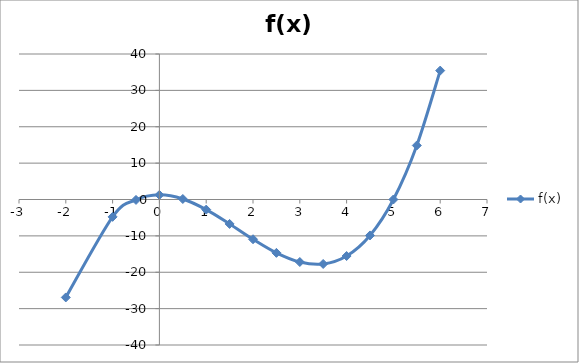
| Category | f(x) |
|---|---|
| -2.0 | -26.928 |
| -1.0 | -4.776 |
| -0.5 | -0.112 |
| 0.0 | 1.276 |
| 0.5 | 0.138 |
| 1.0 | -2.776 |
| 1.5 | -6.714 |
| 2.0 | -10.928 |
| 2.5 | -14.668 |
| 3.0 | -17.184 |
| 3.5 | -17.724 |
| 4.0 | -15.541 |
| 4.5 | -9.882 |
| 5.0 | 0 |
| 5.5 | 14.858 |
| 6.0 | 35.439 |